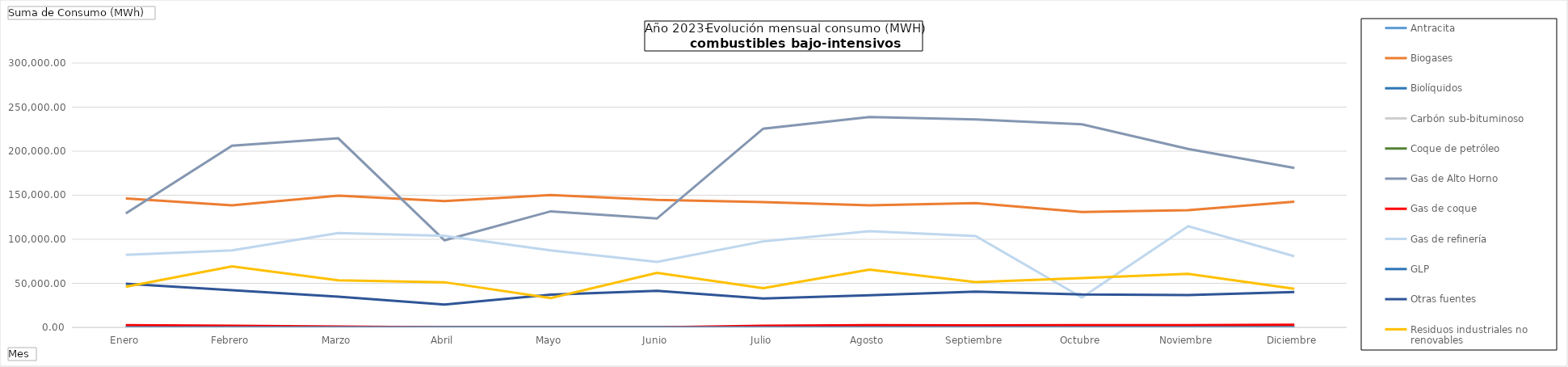
| Category | Antracita | Biogases | Biolíquidos | Carbón sub-bituminoso | Coque de petróleo | Gas de Alto Horno | Gas de coque | Gas de refinería | GLP | Otras fuentes | Residuos industriales no renovables |
|---|---|---|---|---|---|---|---|---|---|---|---|
| Enero | 0 | 146329.98 | 0 | 0 | 0 | 129395 | 2631.89 | 82390 | 12.35 | 49622.33 | 46083 |
| Febrero | 0 | 138608.67 | 0 | 0 | 0 | 206147 | 1862.85 | 87483 | 13.52 | 42184.96 | 69355 |
| Marzo | 0 | 149576.78 | 0 | 0 | 0 | 214628 | 922.14 | 107119 | 45.17 | 34957.97 | 53340 |
| Abril | 0 | 143286.54 | 0 | 0 | 0 | 98877 | 0 | 103818 | 62.88 | 25917.52 | 51249 |
| Mayo | 0 | 150272.85 | 0 | 0 | 0 | 131729 | 0 | 87364 | 13.52 | 37259.59 | 33288 |
| Junio | 0 | 144695.79 | 0 | 0 | 0 | 123554 | 0 | 74295 | 0 | 41551.3 | 61825 |
| Julio | 0 | 142099.34 | 0 | 0 | 0 | 225565 | 1915.81 | 97600 | 5.41 | 32819.1 | 44467 |
| Agosto | 0 | 138556.52 | 0 | 0 | 0 | 238836 | 2482.47 | 109102 | 32.46 | 36572.35 | 65502 |
| Septiembre | 0 | 141039.69 | 0 | 0 | 0 | 235911 | 2333.91 | 103603 | 5.41 | 40577.7 | 51464 |
| Octubre | 0 | 130903.82 | 0 | 0 | 0 | 230534 | 2616.38 | 33961 | 8.12 | 37289.29 | 55924 |
| Noviembre | 0 | 133021.13 | 0 | 0 | 0 | 202468 | 2410.04 | 114796 | 0 | 36717.65 | 60881 |
| Diciembre | 0 | 142653.3 | 0 | 0 | 0 | 180884 | 3027.87 | 80696 | 0 | 40145.93 | 43906 |